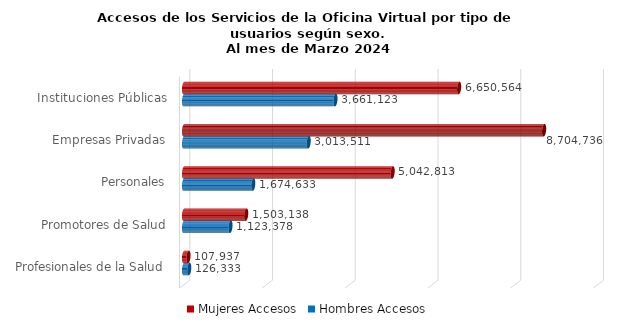
| Category | Mujeres | Hombres |
|---|---|---|
| Instituciones Públicas | 6650564 | 3661123 |
| Empresas Privadas | 8704736 | 3013511 |
| Personales | 5042813 | 1674633 |
| Promotores de Salud | 1503138 | 1123378 |
| Profesionales de la Salud | 107937 | 126333 |